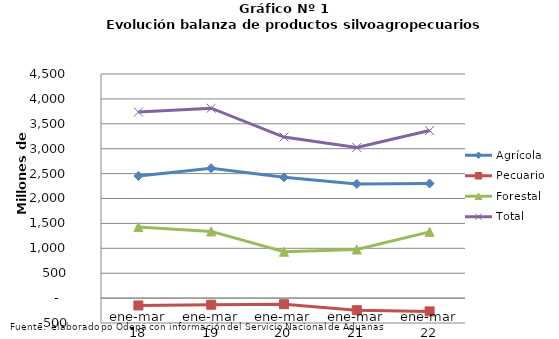
| Category | Agrícola | Pecuario | Forestal | Total |
|---|---|---|---|---|
| ene-mar 18 | 2453328 | -147950 | 1429548 | 3734926 |
| ene-mar 19 | 2607807 | -133164 | 1338965 | 3813608 |
| ene-mar 20 | 2425766 | -122906 | 931517 | 3234377 |
| ene-mar 21 | 2292161 | -242794 | 975593 | 3024960 |
| ene-mar 22 | 2301448 | -267304 | 1330171 | 3364315 |